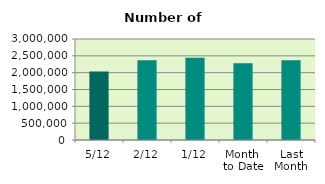
| Category | Series 0 |
|---|---|
| 5/12 | 2031062 |
| 2/12 | 2367618 |
| 1/12 | 2445142 |
| Month 
to Date | 2281274 |
| Last
Month | 2367033.455 |